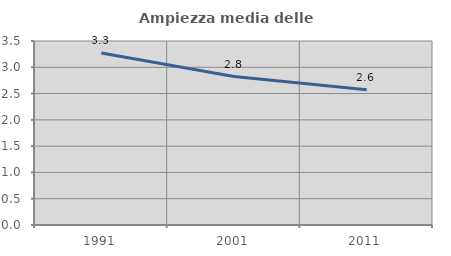
| Category | Ampiezza media delle famiglie |
|---|---|
| 1991.0 | 3.271 |
| 2001.0 | 2.824 |
| 2011.0 | 2.573 |